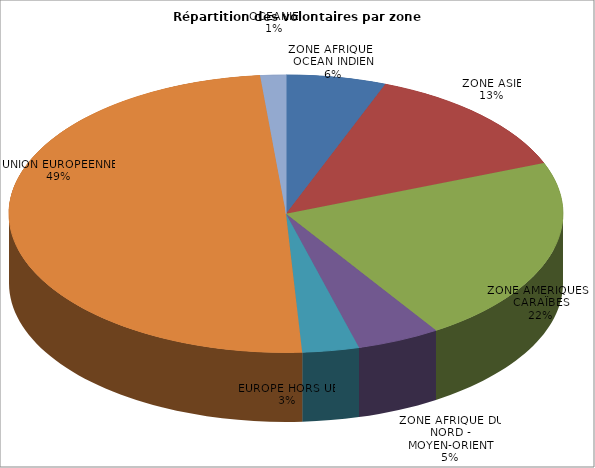
| Category | Nombre de volontaires | % |
|---|---|---|
| ZONE AFRIQUE - OCEAN INDIEN | 589 | 0.058 |
| ZONE ASIE | 1335 | 0.132 |
| ZONE AMERIQUES - CARAÏBES | 2210 | 0.219 |
| ZONE AFRIQUE DU NORD - MOYEN-ORIENT | 491 | 0.049 |
| EUROPE HORS UE | 335 | 0.033 |
| UNION EUROPEENNE | 4997 | 0.494 |
| OCEANIE | 151 | 0.015 |